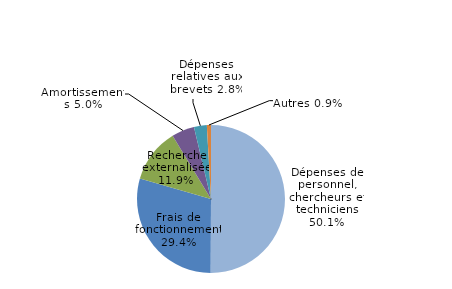
| Category | Series 0 |
|---|---|
| Dépenses de personnel, chercheurs et techniciens | 0.501 |
| Frais de fonctionnement | 0.294 |
| Recherche externalisée | 0.119 |
| Amortissements | 0.05 |
| Dépenses relatives aux brevets | 0.028 |
| Autres | 0.009 |